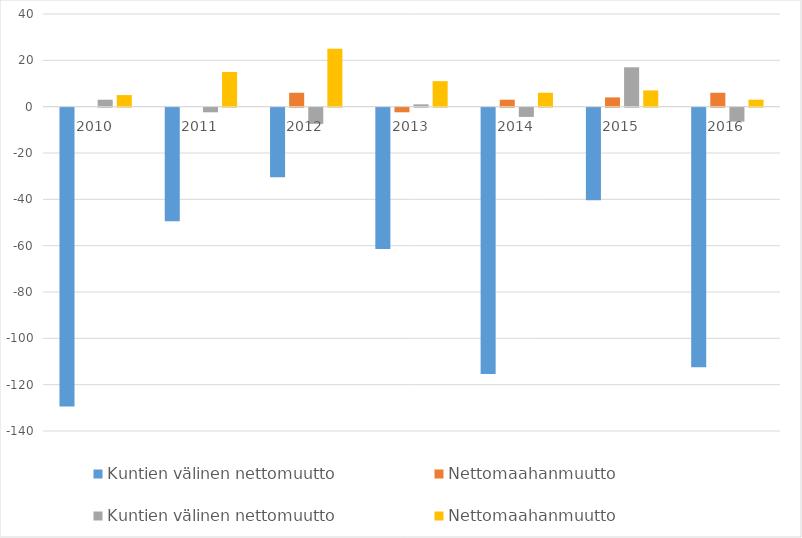
| Category | SUOMALAISTAUSTAISET - Kuntien välinen nettomuutto | SUOMALAISTAUSTAISET - Nettomaahanmuutto | ULKOMAALAISTAUSTAISET - Kuntien välinen nettomuutto | ULKOMAALAISTAUSTAISET - Nettomaahanmuutto |
|---|---|---|---|---|
| 2010 | -129 | 0 | 3 | 5 |
| 2011 | -49 | 0 | -2 | 15 |
| 2012 | -30 | 6 | -7 | 25 |
| 2013 | -61 | -2 | 1 | 11 |
| 2014 | -115 | 3 | -4 | 6 |
| 2015 | -40 | 4 | 17 | 7 |
| 2016 | -112 | 6 | -6 | 3 |